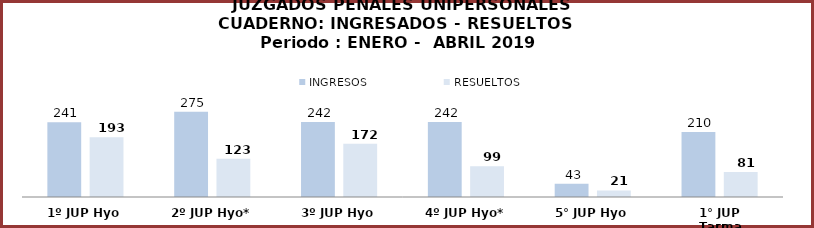
| Category | INGRESOS | RESUELTOS |
|---|---|---|
| 1º JUP Hyo | 241 | 193 |
| 2º JUP Hyo* | 275 | 123 |
| 3º JUP Hyo | 242 | 172 |
| 4º JUP Hyo* | 242 | 99 |
| 5° JUP Hyo | 43 | 21 |
| 1° JUP Tarma | 210 | 81 |